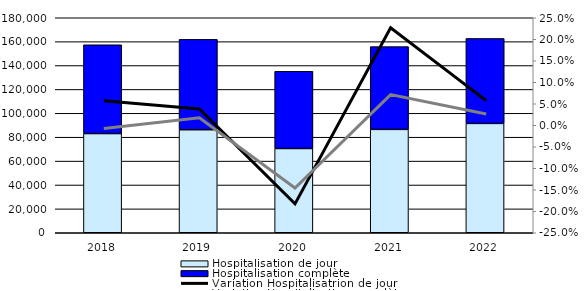
| Category | Hospitalisation de jour | Hospitalisation complète |
|---|---|---|
| 2018.0 | 83056 | 74327 |
| 2019.0 | 86264 | 75653 |
| 2020.0 | 70538 | 64654 |
| 2021.0 | 86556 | 69295 |
| 2022.0 | 91553 | 71133 |